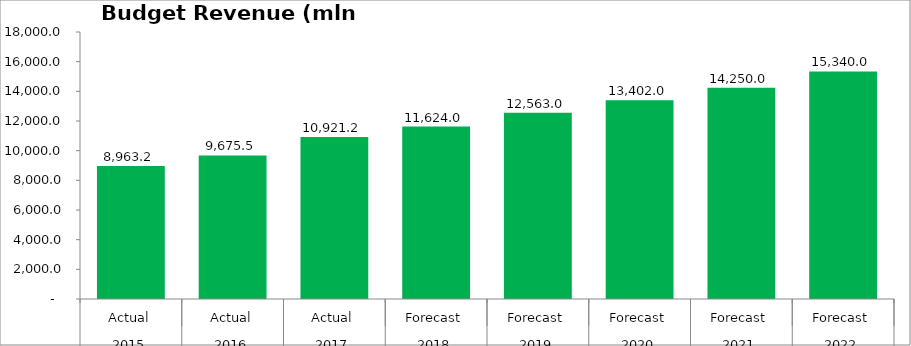
| Category | Budget Revenue (mln GEL) |
|---|---|
| 0 | 8963.173 |
| 1 | 9675.507 |
| 2 | 10921.174 |
| 3 | 11624 |
| 4 | 12563 |
| 5 | 13402 |
| 6 | 14250 |
| 7 | 15340 |